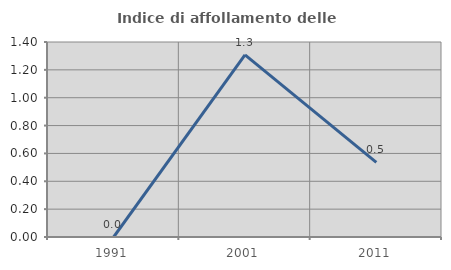
| Category | Indice di affollamento delle abitazioni  |
|---|---|
| 1991.0 | 0 |
| 2001.0 | 1.307 |
| 2011.0 | 0.536 |